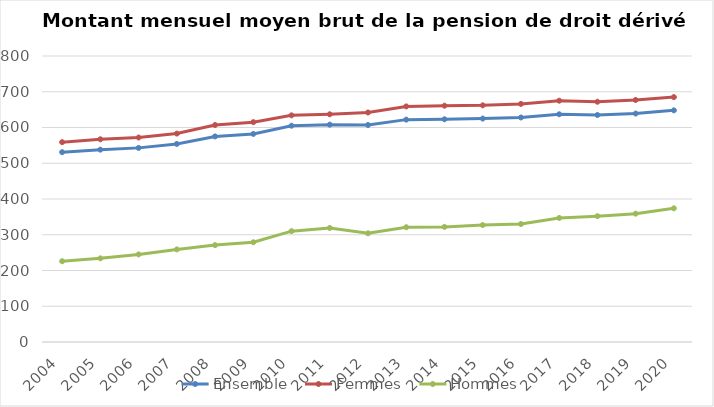
| Category | Ensemble
 | Femmes
 | Hommes
 |
|---|---|---|---|
| 2004.0 | 531 | 559 | 226 |
| 2005.0 | 538 | 567 | 234 |
| 2006.0 | 543 | 572 | 245 |
| 2007.0 | 554 | 583 | 259 |
| 2008.0 | 575 | 607 | 271 |
| 2009.0 | 582 | 615 | 279 |
| 2010.0 | 605 | 634 | 310 |
| 2011.0 | 608 | 637 | 319 |
| 2012.0 | 607 | 642 | 304 |
| 2013.0 | 622 | 659 | 321 |
| 2014.0 | 623 | 661 | 322 |
| 2015.0 | 625 | 662 | 327 |
| 2016.0 | 628 | 666 | 330 |
| 2017.0 | 637 | 675 | 347 |
| 2018.0 | 635 | 672 | 352 |
| 2019.0 | 639 | 677 | 359 |
| 2020.0 | 648 | 685 | 374 |